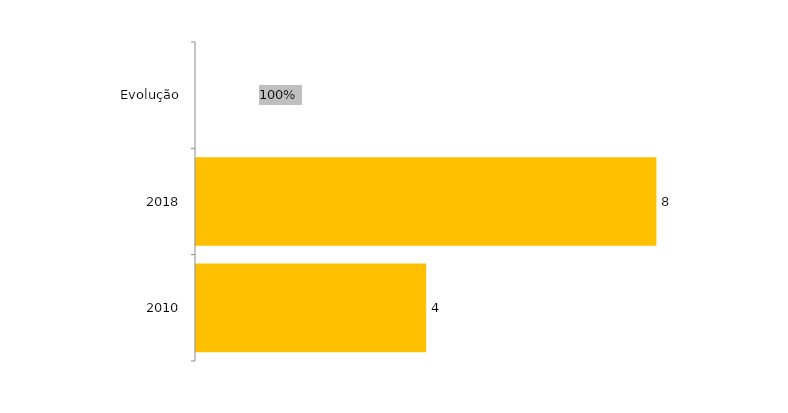
| Category | Evolução Residência |
|---|---|
| 2010 | 4 |
| 2018 | 8 |
| Evolução | 1 |